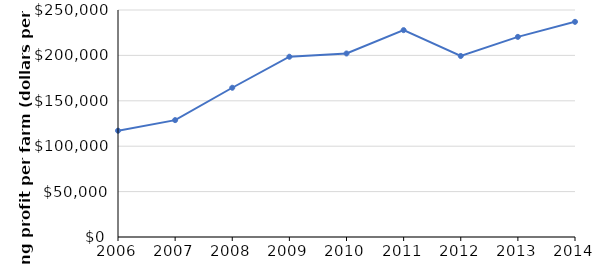
| Category | Series 0 |
|---|---|
| 2006.0 | 117066.481 |
| 2007.0 | 128733.042 |
| 2008.0 | 164370.225 |
| 2009.0 | 198523.644 |
| 2010.0 | 202112.915 |
| 2011.0 | 227814.215 |
| 2012.0 | 199358.797 |
| 2013.0 | 220406.139 |
| 2014.0 | 236961.057 |